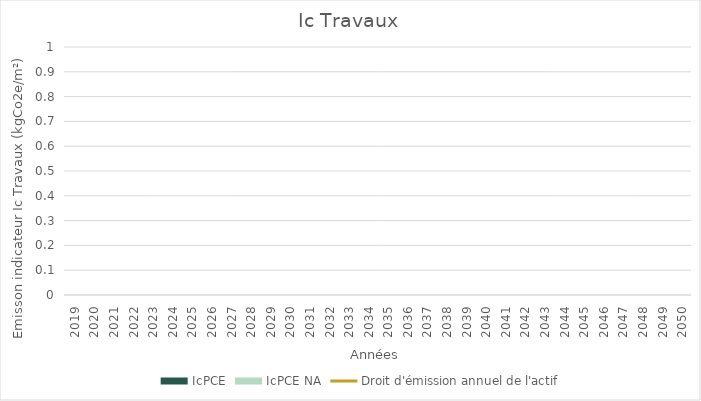
| Category | IcPCE | IcPCE NA |
|---|---|---|
| 2019.0 | 0 | 0 |
| 2020.0 | 0 | 0 |
| 2021.0 | 0 | 0 |
| 2022.0 | 0 | 0 |
| 2023.0 | 0 | 0 |
| 2024.0 | 0 | 0 |
| 2025.0 | 0 | 0 |
| 2026.0 | 0 | 0 |
| 2027.0 | 0 | 0 |
| 2028.0 | 0 | 0 |
| 2029.0 | 0 | 0 |
| 2030.0 | 0 | 0 |
| 2031.0 | 0 | 0 |
| 2032.0 | 0 | 0 |
| 2033.0 | 0 | 0 |
| 2034.0 | 0 | 0 |
| 2035.0 | 0 | 0 |
| 2036.0 | 0 | 0 |
| 2037.0 | 0 | 0 |
| 2038.0 | 0 | 0 |
| 2039.0 | 0 | 0 |
| 2040.0 | 0 | 0 |
| 2041.0 | 0 | 0 |
| 2042.0 | 0 | 0 |
| 2043.0 | 0 | 0 |
| 2044.0 | 0 | 0 |
| 2045.0 | 0 | 0 |
| 2046.0 | 0 | 0 |
| 2047.0 | 0 | 0 |
| 2048.0 | 0 | 0 |
| 2049.0 | 0 | 0 |
| 2050.0 | 0 | 0 |